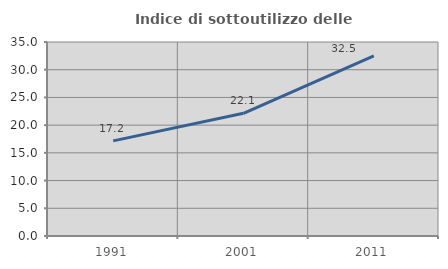
| Category | Indice di sottoutilizzo delle abitazioni  |
|---|---|
| 1991.0 | 17.164 |
| 2001.0 | 22.143 |
| 2011.0 | 32.484 |